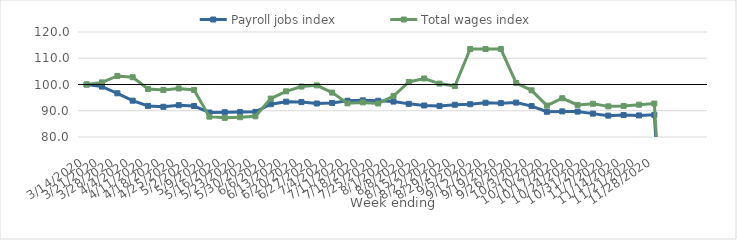
| Category | Payroll jobs index | Total wages index |
|---|---|---|
| 14/03/2020 | 100 | 100 |
| 21/03/2020 | 99.198 | 100.804 |
| 28/03/2020 | 96.645 | 103.246 |
| 04/04/2020 | 93.834 | 102.769 |
| 11/04/2020 | 91.843 | 98.284 |
| 18/04/2020 | 91.505 | 97.911 |
| 25/04/2020 | 92.121 | 98.498 |
| 02/05/2020 | 91.794 | 97.94 |
| 09/05/2020 | 89.329 | 87.748 |
| 16/05/2020 | 89.444 | 87.294 |
| 23/05/2020 | 89.491 | 87.545 |
| 30/05/2020 | 89.576 | 87.876 |
| 06/06/2020 | 92.482 | 94.635 |
| 13/06/2020 | 93.447 | 97.394 |
| 20/06/2020 | 93.297 | 99.222 |
| 27/06/2020 | 92.765 | 99.67 |
| 04/07/2020 | 92.972 | 96.912 |
| 11/07/2020 | 93.816 | 92.826 |
| 18/07/2020 | 93.964 | 93.185 |
| 25/07/2020 | 93.792 | 92.774 |
| 01/08/2020 | 93.499 | 95.579 |
| 08/08/2020 | 92.623 | 100.963 |
| 15/08/2020 | 92.008 | 102.29 |
| 22/08/2020 | 91.84 | 100.349 |
| 29/08/2020 | 92.294 | 99.389 |
| 05/09/2020 | 92.497 | 113.509 |
| 12/09/2020 | 93.031 | 113.509 |
| 19/09/2020 | 92.899 | 113.506 |
| 26/09/2020 | 93.113 | 100.562 |
| 03/10/2020 | 91.784 | 97.77 |
| 10/10/2020 | 89.624 | 91.956 |
| 17/10/2020 | 89.754 | 94.758 |
| 24/10/2020 | 89.678 | 92.22 |
| 31/10/2020 | 88.906 | 92.655 |
| 07/11/2020 | 88.139 | 91.671 |
| 14/11/2020 | 88.364 | 91.851 |
| 21/11/2020 | 88.215 | 92.298 |
| 28/11/2020 | 88.429 | 92.733 |